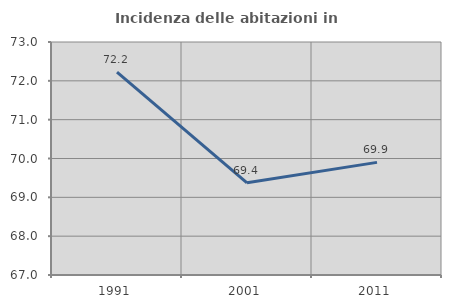
| Category | Incidenza delle abitazioni in proprietà  |
|---|---|
| 1991.0 | 72.226 |
| 2001.0 | 69.373 |
| 2011.0 | 69.9 |